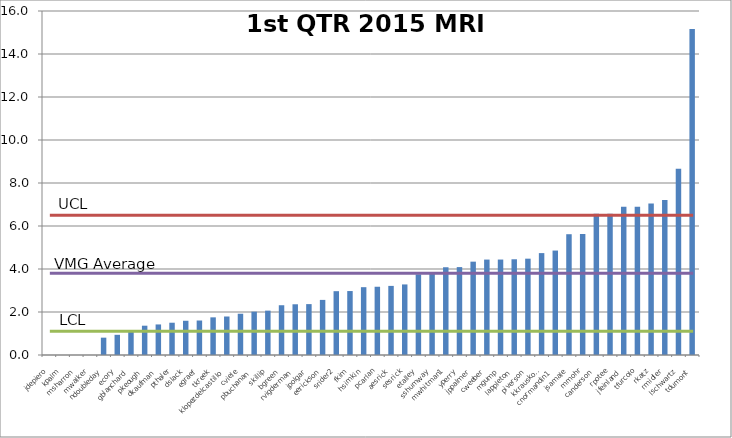
| Category | Series 0 |
|---|---|
| jdepiero | 0 |
| kpalm | 0 |
| msharron | 0 |
| mwalker | 0 |
| ndoubleday | 0.806 |
| ecory | 0.939 |
| gblanchard | 1.132 |
| pkeough | 1.363 |
| dkaufman | 1.421 |
| pthaler | 1.502 |
| dslack | 1.592 |
| egraef | 1.604 |
| tkreek | 1.751 |
| klopezdelcastillo | 1.791 |
| cviele | 1.919 |
| pbuchanan | 2.015 |
| skillip | 2.064 |
| bgreen | 2.315 |
| rvigderman | 2.359 |
| jpolgar | 2.367 |
| eerickson | 2.563 |
| srider2 | 2.968 |
| fkim | 2.975 |
| hsimkin | 3.155 |
| pcarlan | 3.175 |
| aesrick | 3.214 |
| sesrick | 3.282 |
| etalley | 3.751 |
| sshumway | 3.795 |
| mwhitman1 | 4.082 |
| yperry | 4.089 |
| jppalmer | 4.342 |
| cweeber | 4.438 |
| mgump | 4.44 |
| lappleton | 4.453 |
| piverson | 4.48 |
| kkrauskopf | 4.739 |
| cnormandin1 | 4.858 |
| jsamale | 5.618 |
| mmohr | 5.629 |
| canderson | 6.565 |
| rpotee | 6.574 |
| jfeinland | 6.89 |
| tfurcolo | 6.894 |
| rkatz | 7.047 |
| rmidler | 7.212 |
| lschwartz | 8.663 |
| tdumont | 15.161 |